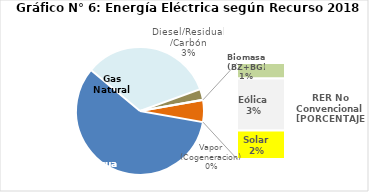
| Category | Series 0 |
|---|---|
| Agua | 2705.554 |
| Gas Natural | 1551.823 |
| Diesel/Residual/Carbón | 126.535 |
| Vapor (Cogeneracion) | 0.43 |
| Biomasa (BZ+BG) | 41.845 |
| Eólica | 140.08 |
| Solar | 76.713 |